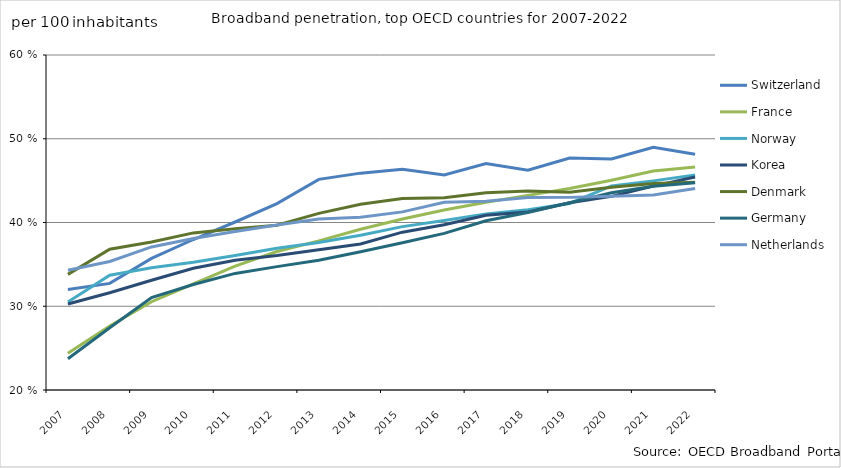
| Category | Switzerland | France | Norway | Korea | Denmark | Germany | Netherlands |
|---|---|---|---|---|---|---|---|
| 2007 | 32 | 24.38 | 30.52 | 30.27 | 33.81 | 23.74 | 34.3 |
| 2008 | 32.73 | 27.64 | 33.71 | 31.61 | 36.81 | 27.44 | 35.34 |
| 2009 | 35.72 | 30.54 | 34.59 | 33.1 | 37.67 | 31.03 | 37.08 |
| 2010 | 37.97 | 32.66 | 35.25 | 34.53 | 38.76 | 32.59 | 38.09 |
| 2011 | 40.06 | 34.8 | 36.05 | 35.48 | 39.24 | 33.92 | 38.93 |
| 2012 | 42.25 | 36.54 | 36.92 | 36.05 | 39.67 | 34.73 | 39.71 |
| 2013 | 45.15 | 37.8 | 37.61 | 36.75 | 41.09 | 35.49 | 40.43 |
| 2014 | 45.894 | 39.198 | 38.488 | 37.425 | 42.17 | 36.517 | 40.623 |
| 2015 | 46.363 | 40.415 | 39.508 | 38.847 | 42.875 | 37.592 | 41.269 |
| 2016 | 45.682 | 41.497 | 40.24 | 39.73 | 42.954 | 38.698 | 42.408 |
| 2017 | 47.048 | 42.421 | 41.031 | 40.865 | 43.562 | 40.205 | 42.549 |
| 2018 | 46.24 | 43.24 | 41.53 | 41.25 | 43.76 | 41.19 | 42.98 |
| 2019 | 47.7 | 44.05 | 42.27 | 42.36 | 43.62 | 42.35 | 43 |
| 2020 | 47.58 | 45.05 | 44.37 | 43.12 | 44.22 | 43.55 | 43.14 |
| 2021 | 48.97 | 46.15 | 44.97 | 44.34 | 44.65 | 44.33 | 43.29 |
| 2022 | 48.16 | 46.62 | 45.66 | 45.43 | 44.8 | 44.76 | 44.06 |